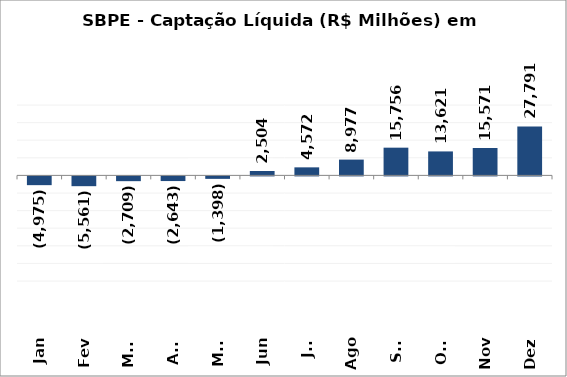
| Category | SBPE - Captação Líquida (R$ Milhões) em 2018 |
|---|---|
| Jan | -4974.781 |
| Fev | -5560.998 |
| Mar | -2708.602 |
| Abr | -2643.342 |
| Mai | -1398.295 |
| Jun | 2504.228 |
| Jul | 4571.518 |
| Ago | 8976.601 |
| Set | 15755.841 |
| Out | 13621.116 |
| Nov | 15571.225 |
| Dez | 27791.076 |